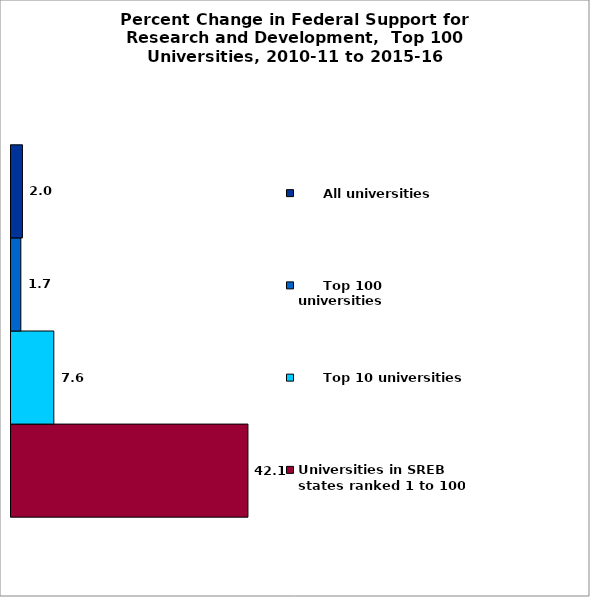
| Category | Universities in SREB states ranked 1 to 100 |      Top 10 universities |      Top 100 universities |      All universities |
|---|---|---|---|---|
| 0 | 42.144 | 7.616 | 1.75 | 2.037 |